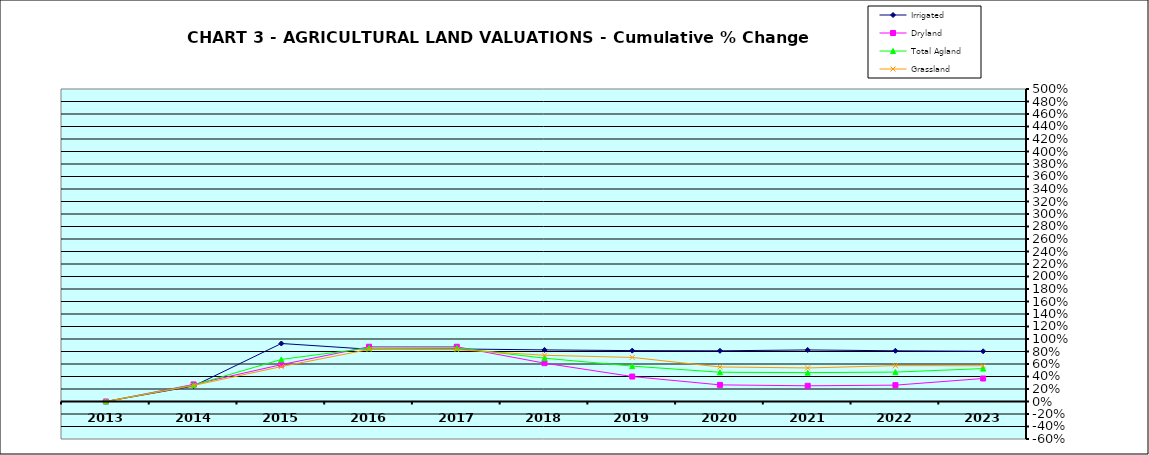
| Category | Irrigated | Dryland | Total Agland | Grassland |
|---|---|---|---|---|
| 2013.0 | 0 | 0 | 0 | 0 |
| 2014.0 | 0.247 | 0.273 | 0.263 | 0.256 |
| 2015.0 | 0.928 | 0.59 | 0.673 | 0.559 |
| 2016.0 | 0.836 | 0.876 | 0.857 | 0.833 |
| 2017.0 | 0.841 | 0.876 | 0.858 | 0.829 |
| 2018.0 | 0.826 | 0.614 | 0.693 | 0.739 |
| 2019.0 | 0.814 | 0.399 | 0.566 | 0.705 |
| 2020.0 | 0.811 | 0.266 | 0.468 | 0.553 |
| 2021.0 | 0.825 | 0.251 | 0.462 | 0.537 |
| 2022.0 | 0.811 | 0.262 | 0.471 | 0.574 |
| 2023.0 | 0.803 | 0.368 | 0.527 | 0.572 |